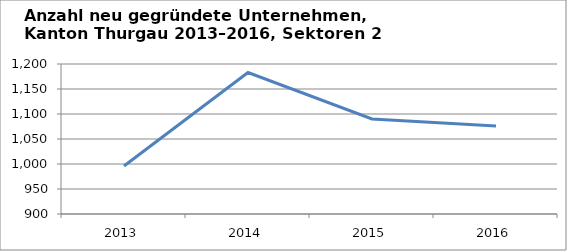
| Category | Sektoren 2 und 3 |
|---|---|
| 2013.0 | 996 |
| 2014.0 | 1183 |
| 2015.0 | 1090 |
| 2016.0 | 1076 |